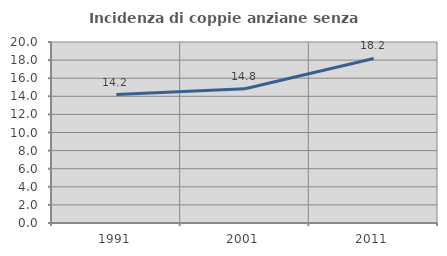
| Category | Incidenza di coppie anziane senza figli  |
|---|---|
| 1991.0 | 14.187 |
| 2001.0 | 14.829 |
| 2011.0 | 18.182 |